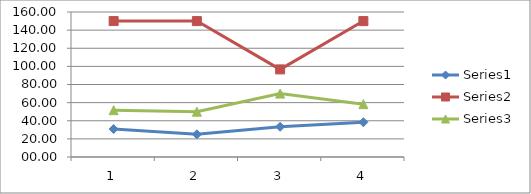
| Category | Series 0 | Series 1 | Series 2 |
|---|---|---|---|
| 0 | 30.83 | 150 | 51.66 |
| 1 | 25 | 150 | 50 |
| 2 | 33.33 | 96.66 | 70 |
| 3 | 38.33 | 150 | 58.33 |